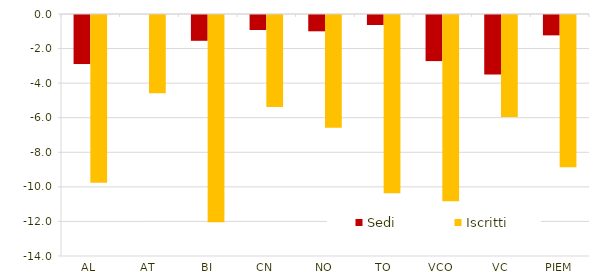
| Category | Sedi | Iscritti |
|---|---|---|
| AL | -2.837 | -9.706 |
| AT | 0 | -4.528 |
| BI | -1.493 | -11.995 |
| CN | -0.87 | -5.317 |
| NO | -0.943 | -6.521 |
| TO | -0.58 | -10.316 |
| VCO | -2.667 | -10.78 |
| VC | -3.448 | -5.895 |
| PIEM | -1.178 | -8.806 |